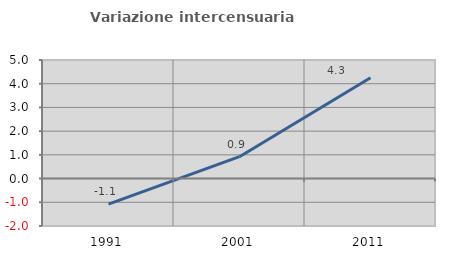
| Category | Variazione intercensuaria annua |
|---|---|
| 1991.0 | -1.081 |
| 2001.0 | 0.924 |
| 2011.0 | 4.255 |